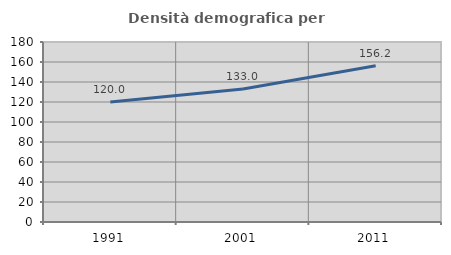
| Category | Densità demografica |
|---|---|
| 1991.0 | 120.03 |
| 2001.0 | 132.96 |
| 2011.0 | 156.235 |